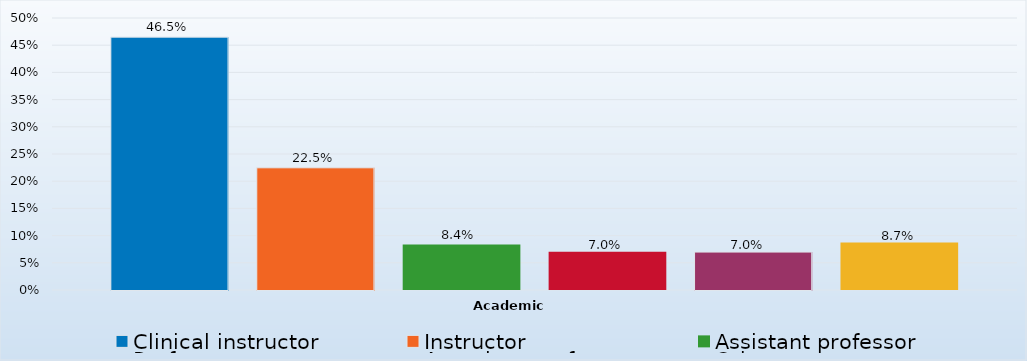
| Category | Clinical instructor | Instructor | Assistant professor | Professor | Associate professor | Other |
|---|---|---|---|---|---|---|
| 0 | 0.465 | 0.225 | 0.084 | 0.07 | 0.07 | 0.087 |